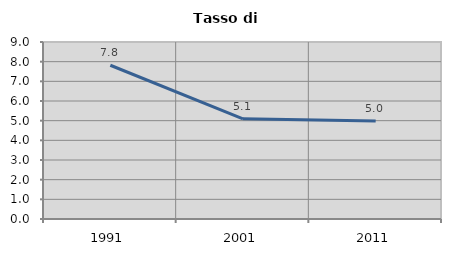
| Category | Tasso di disoccupazione   |
|---|---|
| 1991.0 | 7.817 |
| 2001.0 | 5.093 |
| 2011.0 | 4.987 |